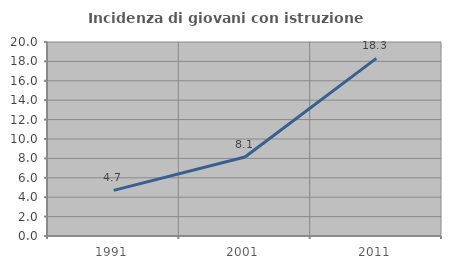
| Category | Incidenza di giovani con istruzione universitaria |
|---|---|
| 1991.0 | 4.7 |
| 2001.0 | 8.14 |
| 2011.0 | 18.314 |